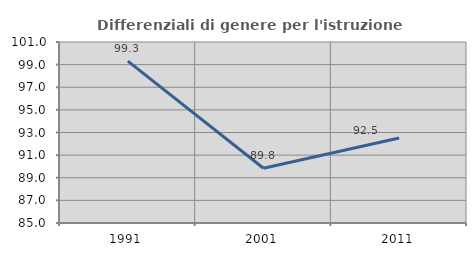
| Category | Differenziali di genere per l'istruzione superiore |
|---|---|
| 1991.0 | 99.309 |
| 2001.0 | 89.843 |
| 2011.0 | 92.522 |